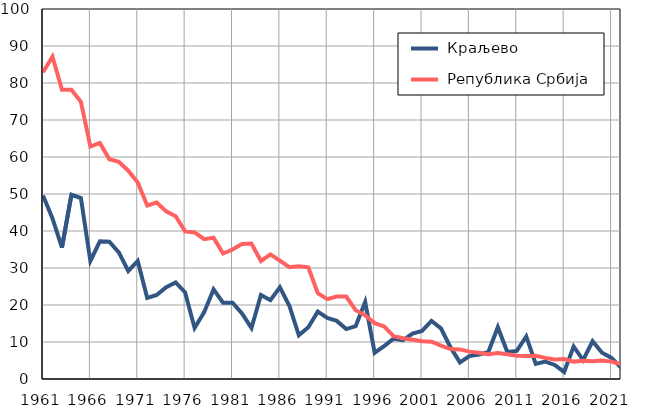
| Category |  Краљево |  Република Србија |
|---|---|---|
| 1961.0 | 49.6 | 82.9 |
| 1962.0 | 43.4 | 87.1 |
| 1963.0 | 35.5 | 78.2 |
| 1964.0 | 49.8 | 78.2 |
| 1965.0 | 48.9 | 74.9 |
| 1966.0 | 31.9 | 62.8 |
| 1967.0 | 37.2 | 63.8 |
| 1968.0 | 37.1 | 59.4 |
| 1969.0 | 34.2 | 58.7 |
| 1970.0 | 29.2 | 56.3 |
| 1971.0 | 31.9 | 53.1 |
| 1972.0 | 21.9 | 46.9 |
| 1973.0 | 22.7 | 47.7 |
| 1974.0 | 24.8 | 45.3 |
| 1975.0 | 26.1 | 44 |
| 1976.0 | 23.4 | 39.9 |
| 1977.0 | 13.8 | 39.6 |
| 1978.0 | 18 | 37.8 |
| 1979.0 | 24.2 | 38.2 |
| 1980.0 | 20.6 | 33.9 |
| 1981.0 | 20.6 | 35 |
| 1982.0 | 17.7 | 36.5 |
| 1983.0 | 13.8 | 36.6 |
| 1984.0 | 22.7 | 31.9 |
| 1985.0 | 21.3 | 33.7 |
| 1986.0 | 24.8 | 32 |
| 1987.0 | 19.8 | 30.2 |
| 1988.0 | 11.8 | 30.5 |
| 1989.0 | 14 | 30.2 |
| 1990.0 | 18.2 | 23.2 |
| 1991.0 | 16.5 | 21.6 |
| 1992.0 | 15.7 | 22.3 |
| 1993.0 | 13.5 | 22.3 |
| 1994.0 | 14.3 | 18.6 |
| 1995.0 | 20.8 | 17.2 |
| 1996.0 | 7.1 | 15.1 |
| 1997.0 | 8.9 | 14.2 |
| 1998.0 | 10.9 | 11.6 |
| 1999.0 | 10.5 | 11 |
| 2000.0 | 12.3 | 10.6 |
| 2001.0 | 13 | 10.2 |
| 2002.0 | 15.7 | 10.1 |
| 2003.0 | 13.7 | 9 |
| 2004.0 | 8.6 | 8.1 |
| 2005.0 | 4.5 | 8 |
| 2006.0 | 6.2 | 7.4 |
| 2007.0 | 6.6 | 7.1 |
| 2008.0 | 7.3 | 6.7 |
| 2009.0 | 14 | 7 |
| 2010.0 | 7.3 | 6.7 |
| 2011.0 | 7.6 | 6.3 |
| 2012.0 | 11.5 | 6.2 |
| 2013.0 | 4.1 | 6.3 |
| 2014.0 | 4.7 | 5.7 |
| 2015.0 | 3.8 | 5.3 |
| 2016.0 | 1.9 | 5.4 |
| 2017.0 | 8.8 | 4.7 |
| 2018.0 | 5.1 | 4.9 |
| 2019.0 | 10.2 | 4.8 |
| 2020.0 | 7.1 | 5 |
| 2021.0 | 5.7 | 4.7 |
| 2022.0 | 3.1 | 4 |